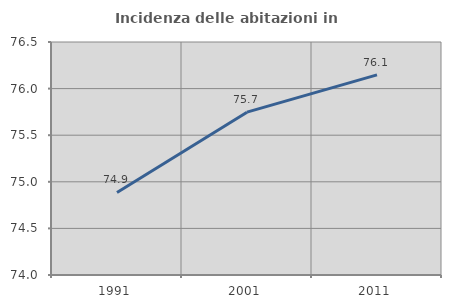
| Category | Incidenza delle abitazioni in proprietà  |
|---|---|
| 1991.0 | 74.885 |
| 2001.0 | 75.747 |
| 2011.0 | 76.147 |